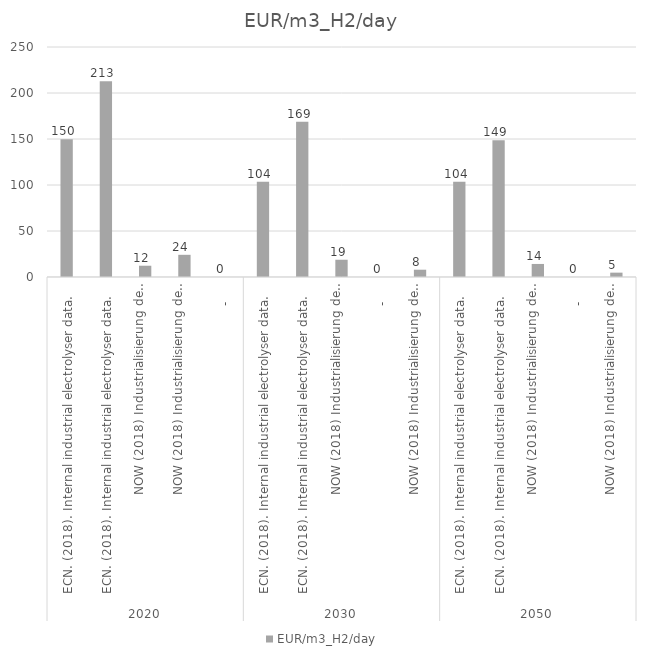
| Category | EUR/m3_H2/day |
|---|---|
| 0 | 149.682 |
| 1 | 212.707 |
| 2 | 12.258 |
| 3 | 24.12 |
| 4 | 0 |
| 5 | 103.54 |
| 6 | 168.815 |
| 7 | 18.761 |
| 8 | 0 |
| 9 | 7.93 |
| 10 | 103.54 |
| 11 | 148.557 |
| 12 | 14.183 |
| 13 | 0 |
| 14 | 4.728 |